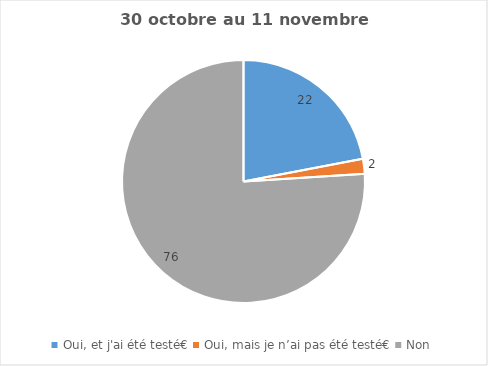
| Category | Series 0 |
|---|---|
| Oui, et j'ai été testé€ | 22 |
| Oui, mais je n’ai pas été testé€ | 2 |
| Non | 76 |